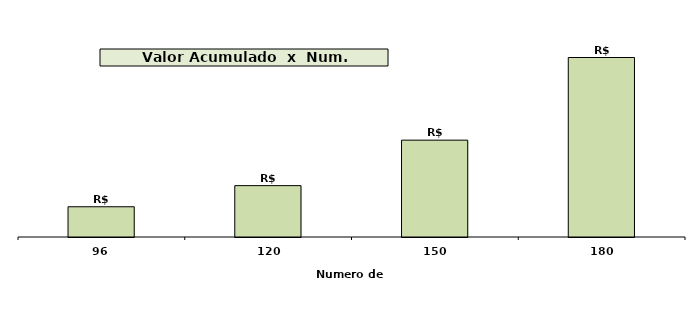
| Category | Valor Acumulado |
|---|---|
| 96.0 | 708726.672 |
| 120.0 | 1204036.475 |
| 150.0 | 2269798.042 |
| 180.0 | 4206975.279 |